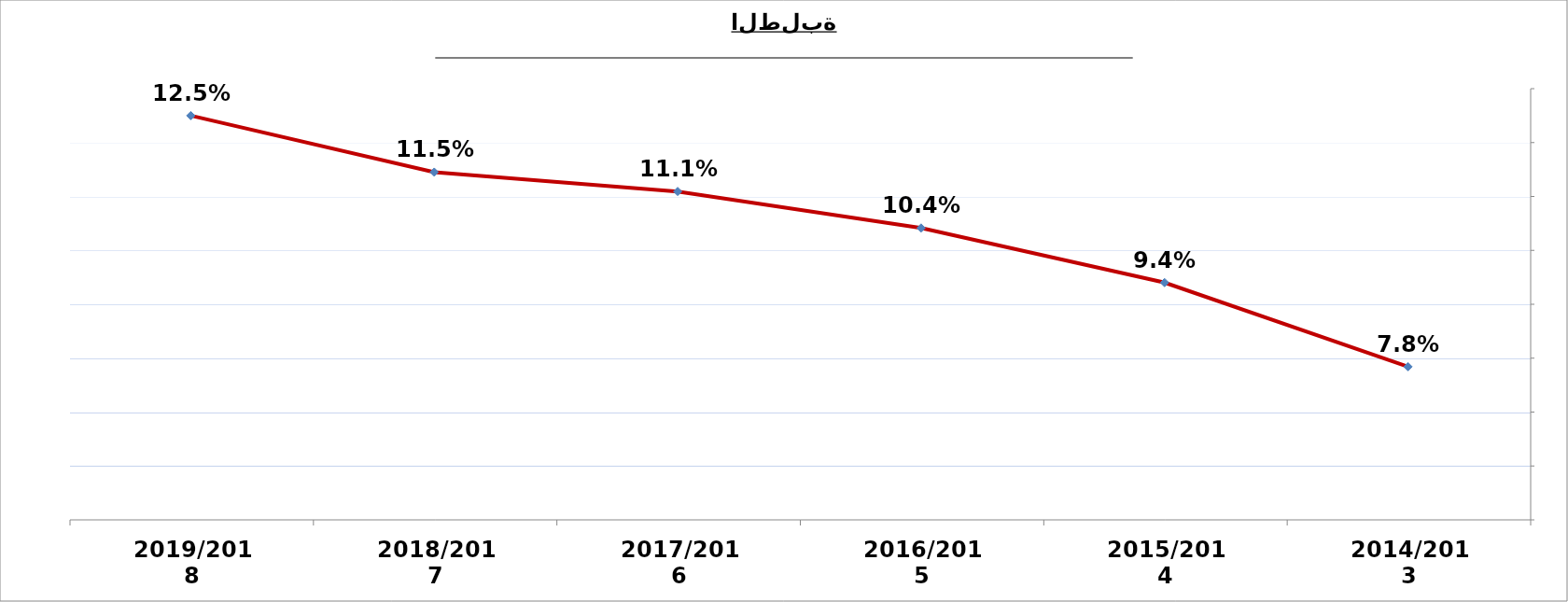
| Category | النسبة المأوية بالمقارنة مع العدد الجملي للطلبة |
|---|---|
| 2014/2013 | 0.078 |
| 2015/2014 | 0.094 |
| 2016/2015 | 0.104 |
| 2017/2016 | 0.111 |
| 2018/2017 | 0.115 |
| 2019/2018 | 0.125 |